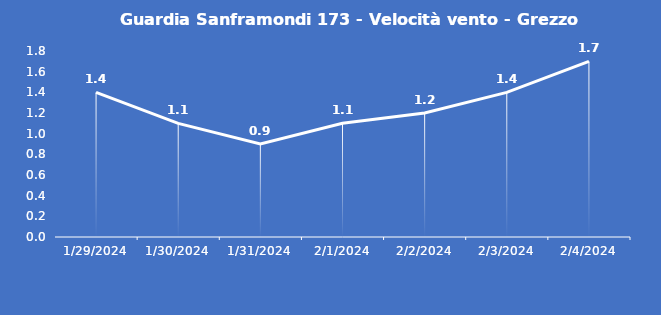
| Category | Guardia Sanframondi 173 - Velocità vento - Grezzo (m/s) |
|---|---|
| 1/29/24 | 1.4 |
| 1/30/24 | 1.1 |
| 1/31/24 | 0.9 |
| 2/1/24 | 1.1 |
| 2/2/24 | 1.2 |
| 2/3/24 | 1.4 |
| 2/4/24 | 1.7 |